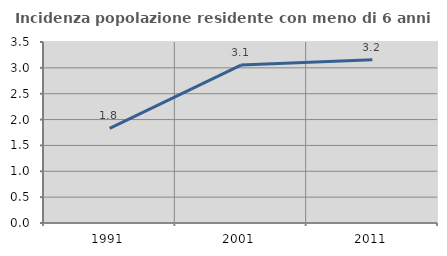
| Category | Incidenza popolazione residente con meno di 6 anni |
|---|---|
| 1991.0 | 1.829 |
| 2001.0 | 3.053 |
| 2011.0 | 3.158 |